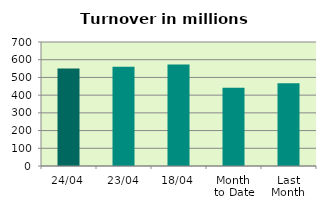
| Category | Series 0 |
|---|---|
| 24/04 | 550.021 |
| 23/04 | 559.957 |
| 18/04 | 573.575 |
| Month 
to Date | 441.858 |
| Last
Month | 466.511 |